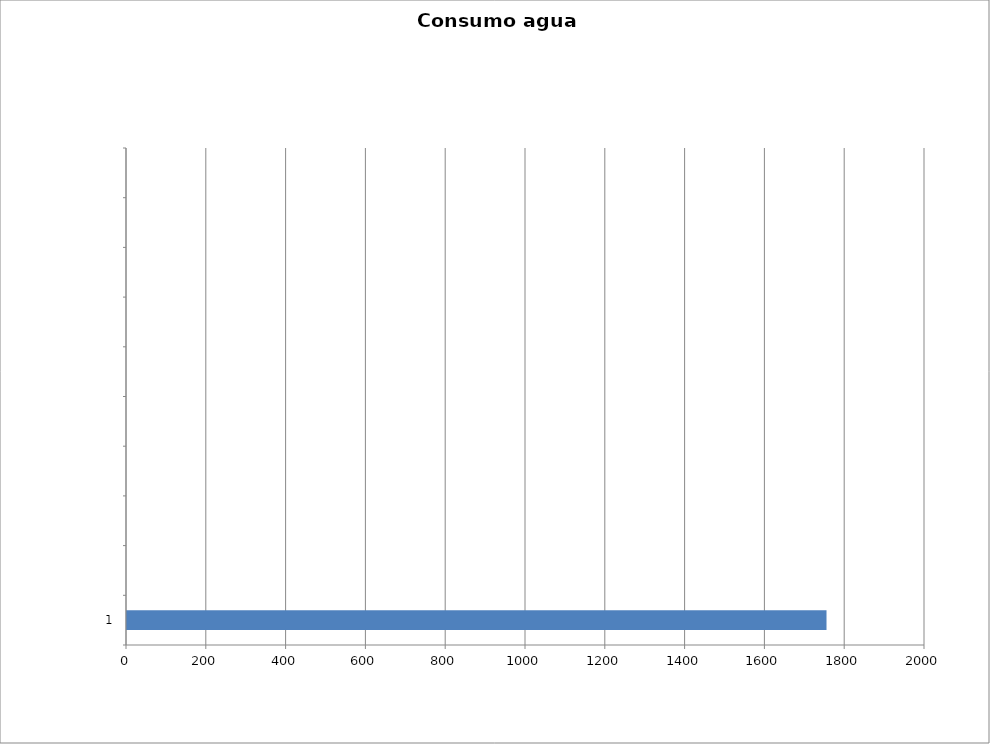
| Category | Series 0 |
|---|---|
| 1 | 1753.167 |